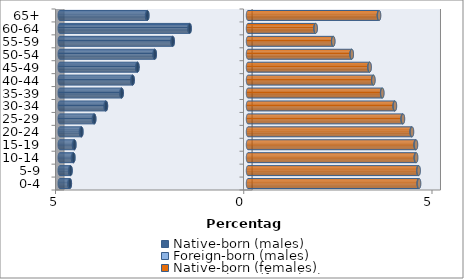
| Category | Native-born (males) | Foreign-born (males) | Native-born (females) | Foreign-born (females) |
|---|---|---|---|---|
| 0-4 | -4.731 | -0.015 | 4.534 | 0.013 |
| 5-9 | -4.713 | -0.013 | 4.522 | 0.012 |
| 10-14 | -4.637 | -0.014 | 4.456 | 0.013 |
| 15-19 | -4.611 | -0.013 | 4.451 | 0.013 |
| 20-24 | -4.425 | -0.013 | 4.345 | 0.013 |
| 25-29 | -4.084 | -0.012 | 4.106 | 0.012 |
| 30-34 | -3.773 | -0.011 | 3.895 | 0.009 |
| 35-39 | -3.354 | -0.01 | 3.562 | 0.008 |
| 40-44 | -3.063 | -0.008 | 3.326 | 0.006 |
| 45-49 | -2.936 | -0.007 | 3.226 | 0.005 |
| 50-54 | -2.476 | -0.007 | 2.752 | 0.005 |
| 55-59 | -1.999 | -0.006 | 2.261 | 0.004 |
| 60-64 | -1.55 | -0.005 | 1.794 | 0.004 |
| 65+ | -2.674 | -0.009 | 3.476 | 0.008 |